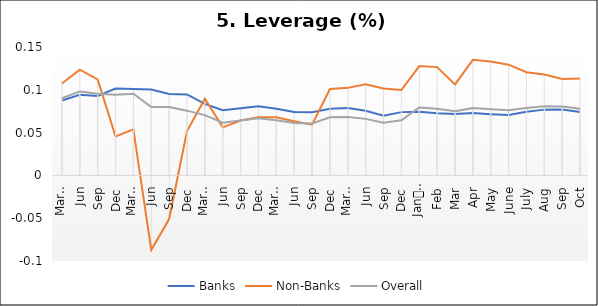
| Category | Banks | Non-Banks | Overall |
|---|---|---|---|
| 0 | 0.088 | 0.107 | 0.09 |
| 1 | 0.094 | 0.123 | 0.098 |
| 2 | 0.093 | 0.112 | 0.095 |
| 3 | 0.102 | 0.046 | 0.094 |
| 4 | 0.101 | 0.054 | 0.095 |
| 5 | 0.1 | -0.087 | 0.08 |
| 6 | 0.095 | -0.051 | 0.08 |
| 7 | 0.095 | 0.052 | 0.076 |
| 8 | 0.084 | 0.09 | 0.07 |
| 9 | 0.076 | 0.056 | 0.062 |
| 10 | 0.079 | 0.064 | 0.064 |
| 11 | 0.081 | 0.068 | 0.067 |
| 12 | 0.078 | 0.068 | 0.064 |
| 13 | 0.074 | 0.063 | 0.061 |
| 14 | 0.074 | 0.059 | 0.061 |
| 15 | 0.078 | 0.101 | 0.068 |
| 16 | 0.079 | 0.102 | 0.068 |
| 17 | 0.075 | 0.106 | 0.066 |
| 18 | 0.07 | 0.102 | 0.061 |
| 19 | 0.074 | 0.1 | 0.064 |
| 20 | 0.074 | 0.128 | 0.079 |
| 21 | 0.073 | 0.126 | 0.078 |
| 22 | 0.072 | 0.106 | 0.075 |
| 23 | 0.073 | 0.135 | 0.079 |
| 24 | 0.072 | 0.133 | 0.077 |
| 25 | 0.071 | 0.129 | 0.076 |
| 26 | 0.074 | 0.121 | 0.079 |
| 27 | 0.077 | 0.118 | 0.081 |
| 28 | 0.077 | 0.113 | 0.08 |
| 29 | 0.074 | 0.113 | 0.078 |